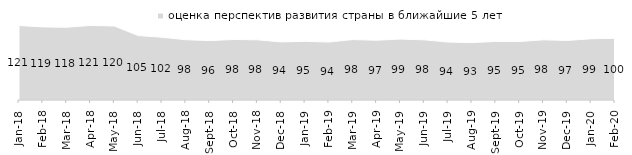
| Category | оценка перспектив развития страны в ближайшие 5 лет |
|---|---|
| 2018-01-01 | 120.9 |
| 2018-02-01 | 118.65 |
| 2018-03-01 | 118.1 |
| 2018-04-01 | 121 |
| 2018-05-01 | 120.15 |
| 2018-06-01 | 104.6 |
| 2018-07-01 | 101.85 |
| 2018-08-01 | 97.85 |
| 2018-09-01 | 96.4 |
| 2018-10-01 | 98.25 |
| 2018-11-01 | 97.705 |
| 2018-12-01 | 94.3 |
| 2019-01-01 | 95.25 |
| 2019-02-01 | 94.05 |
| 2019-03-01 | 98.11 |
| 2019-04-01 | 97.03 |
| 2019-05-01 | 98.91 |
| 2019-06-01 | 97.656 |
| 2019-07-01 | 94.01 |
| 2019-08-01 | 93.207 |
| 2019-09-01 | 95.099 |
| 2019-10-01 | 95 |
| 2019-11-01 | 97.673 |
| 2019-12-01 | 96.733 |
| 2020-01-01 | 99.356 |
| 2020-02-01 | 100.198 |